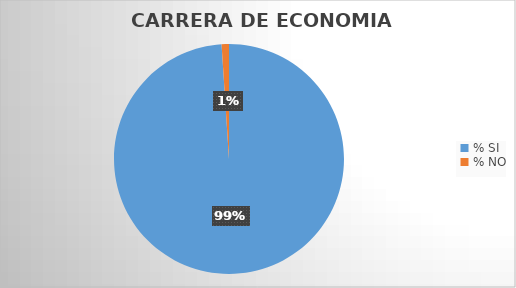
| Category | Series 0 |
|---|---|
| % SI | 98.969 |
| % NO | 1.031 |